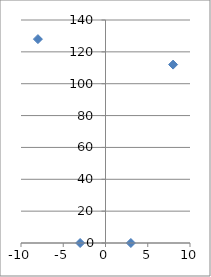
| Category | Series 0 |
|---|---|
| -3.0 | 0 |
| 3.0 | 0 |
| -8.0 | 128 |
| 8.0 | 112 |